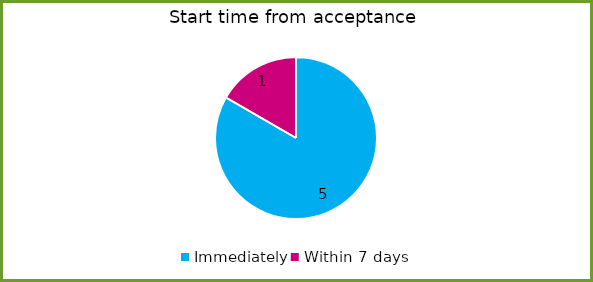
| Category | Series 0 |
|---|---|
| Immediately | 5 |
| Within 7 days | 1 |